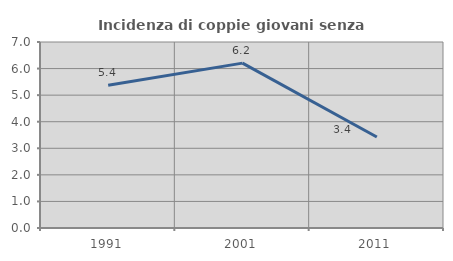
| Category | Incidenza di coppie giovani senza figli |
|---|---|
| 1991.0 | 5.376 |
| 2001.0 | 6.205 |
| 2011.0 | 3.425 |